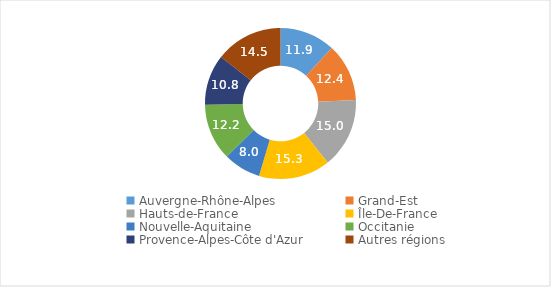
| Category | Series 0 |
|---|---|
| Auvergne-Rhône-Alpes | 11.885 |
| Grand-Est | 12.394 |
| Hauts-de-France | 14.969 |
| Île-De-France | 15.346 |
| Nouvelle-Aquitaine | 7.986 |
| Occitanie | 12.175 |
| Provence-Alpes-Côte d'Azur | 10.772 |
| Autres régions | 14.471 |